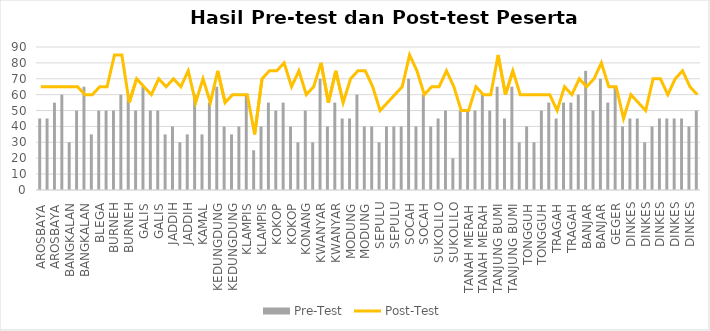
| Category | NPWP | TTD | Pre-Test |
|---|---|---|---|
| AROSBAYA |  |  | 45 |
| AROSBAYA |  |  | 45 |
| AROSBAYA |  |  | 55 |
| BANGKALAN |  |  | 60 |
| BANGKALAN |  |  | 30 |
| BANGKALAN |  |  | 50 |
| BANGKALAN |  |  | 65 |
| BLEGA |  |  | 35 |
| BLEGA |  |  | 50 |
| BLEGA |  |  | 50 |
| BURNEH |  |  | 50 |
| BURNEH |  |  | 60 |
| BURNEH |  |  | 60 |
| GALIS |  |  | 50 |
| GALIS |  |  | 65 |
| GALIS |  |  | 50 |
| GALIS |  |  | 50 |
| JADDIH |  |  | 35 |
| JADDIH |  |  | 40 |
| JADDIH |  |  | 30 |
| JADDIH |  |  | 35 |
| KAMAL |  |  | 60 |
| KAMAL |  |  | 35 |
| KAMAL |  |  | 55 |
| KEDUNGDUNG |  |  | 65 |
| KEDUNGDUNG |  |  | 40 |
| KEDUNGDUNG |  |  | 35 |
| KEDUNGDUNG |  |  | 40 |
| KLAMPIS |  |  | 60 |
| KLAMPIS |  |  | 25 |
| KLAMPIS |  |  | 40 |
| KLAMPIS |  |  | 55 |
| KOKOP |  |  | 50 |
| KOKOP |  |  | 55 |
| KOKOP |  |  | 40 |
| KONANG |  |  | 30 |
| KONANG |  |  | 50 |
| KONANG |  |  | 30 |
| KWANYAR |  |  | 70 |
| KWANYAR |  |  | 40 |
| KWANYAR |  |  | 55 |
| KWANYAR |  |  | 45 |
| MODUNG |  |  | 45 |
| MODUNG |  |  | 60 |
| MODUNG |  |  | 40 |
| MODUNG |  |  | 40 |
| SEPULU |  |  | 30 |
| SEPULU |  |  | 40 |
| SEPULU |  |  | 40 |
| SEPULU |  |  | 40 |
| SOCAH |  |  | 70 |
| SOCAH |  |  | 40 |
| SOCAH |  |  | 60 |
| SUKOLILO |  |  | 40 |
| SUKOLILO |  |  | 45 |
| SUKOLILO |  |  | 50 |
| SUKOLILO |  |  | 20 |
| TANAH MERAH |  |  | 50 |
| TANAH MERAH |  |  | 50 |
| TANAH MERAH |  |  | 50 |
| TANAH MERAH |  |  | 60 |
| TANJUNG BUMI |  |  | 50 |
| TANJUNG BUMI |  |  | 65 |
| TANJUNG BUMI |  |  | 45 |
| TANJUNG BUMI |  |  | 65 |
| TONGGUH |  |  | 30 |
| TONGGUH |  |  | 40 |
| TONGGUH |  |  | 30 |
| TONGGUH |  |  | 50 |
| TRAGAH |  |  | 55 |
| TRAGAH |  |  | 45 |
| TRAGAH |  |  | 55 |
| TRAGAH |  |  | 55 |
| BANJAR |  |  | 60 |
| BANJAR |  |  | 75 |
| BANJAR |  |  | 50 |
| BANJAR |  |  | 70 |
| GEGER |  |  | 55 |
| GEGER |  |  | 65 |
| GEGER |  |  | 40 |
| DINKES |  |  | 45 |
| DINKES |  |  | 45 |
| DINKES |  |  | 30 |
| DINKES |  |  | 40 |
| DINKES |  |  | 45 |
| DINKES |  |  | 45 |
| DINKES |  |  | 45 |
| DINKES |  |  | 45 |
| DINKES |  |  | 40 |
| DINKES |  |  | 50 |